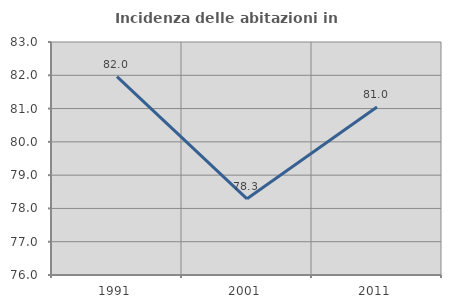
| Category | Incidenza delle abitazioni in proprietà  |
|---|---|
| 1991.0 | 81.959 |
| 2001.0 | 78.289 |
| 2011.0 | 81.048 |